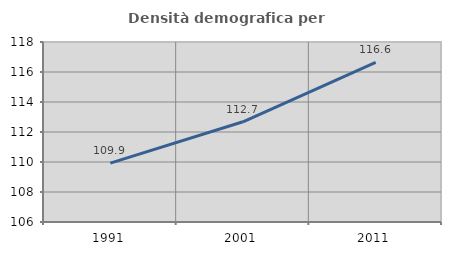
| Category | Densità demografica |
|---|---|
| 1991.0 | 109.923 |
| 2001.0 | 112.68 |
| 2011.0 | 116.636 |